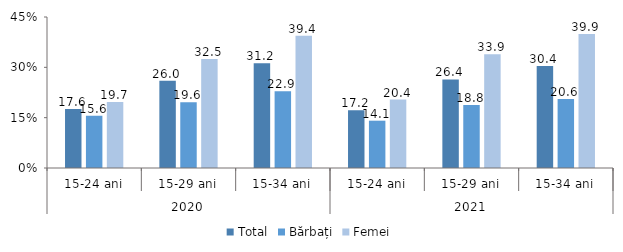
| Category | Total | Bărbați | Femei |
|---|---|---|---|
| 0 | 17.6 | 15.6 | 19.7 |
| 1 | 26 | 19.6 | 32.5 |
| 2 | 31.2 | 22.9 | 39.4 |
| 3 | 17.2 | 14.1 | 20.4 |
| 4 | 26.4 | 18.8 | 33.9 |
| 5 | 30.4 | 20.6 | 39.9 |